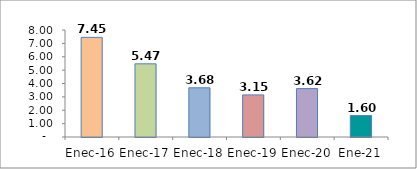
| Category | Series 0 |
|---|---|
| Enec-16 | 7.448 |
| Enec-17 | 5.471 |
| Enec-18 | 3.678 |
| Enec-19 | 3.148 |
| Enec-20 | 3.618 |
| Ene-21 | 1.602 |